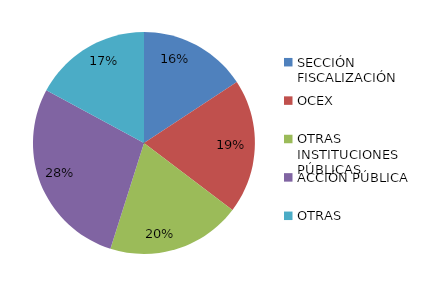
| Category | Series 0 |
|---|---|
| SECCIÓN
FISCALIZACIÓN | 58 |
| OCEX | 72 |
| OTRAS INSTITUCIONES PÚBLICAS | 72 |
| ACCIÓN PÚBLICA | 103 |
| OTRAS | 63 |